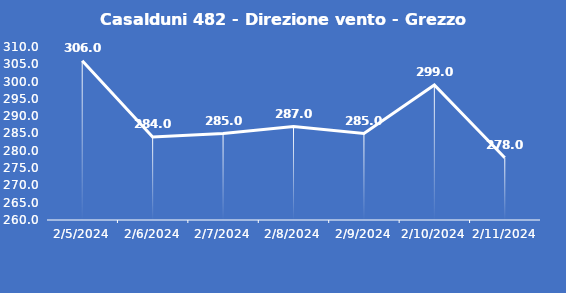
| Category | Casalduni 482 - Direzione vento - Grezzo (°N) |
|---|---|
| 2/5/24 | 306 |
| 2/6/24 | 284 |
| 2/7/24 | 285 |
| 2/8/24 | 287 |
| 2/9/24 | 285 |
| 2/10/24 | 299 |
| 2/11/24 | 278 |